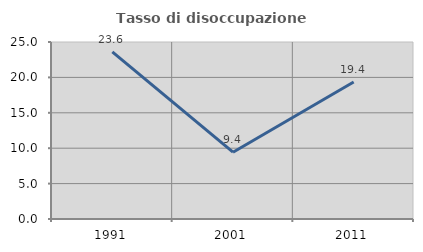
| Category | Tasso di disoccupazione giovanile  |
|---|---|
| 1991.0 | 23.611 |
| 2001.0 | 9.434 |
| 2011.0 | 19.355 |